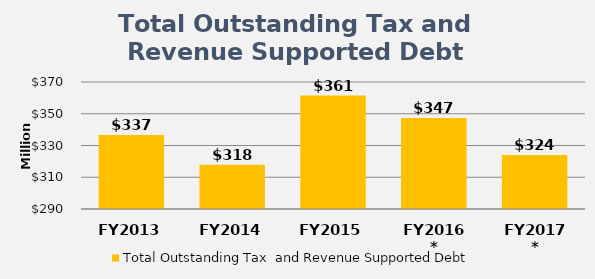
| Category | Total Outstanding Tax  and Revenue Supported Debt |
|---|---|
| FY2013 | 336635000 |
| FY2014 | 317820000 |
| FY2015 | 361420000 |
| FY2016* | 347249000 |
| FY2017* | 324065000 |